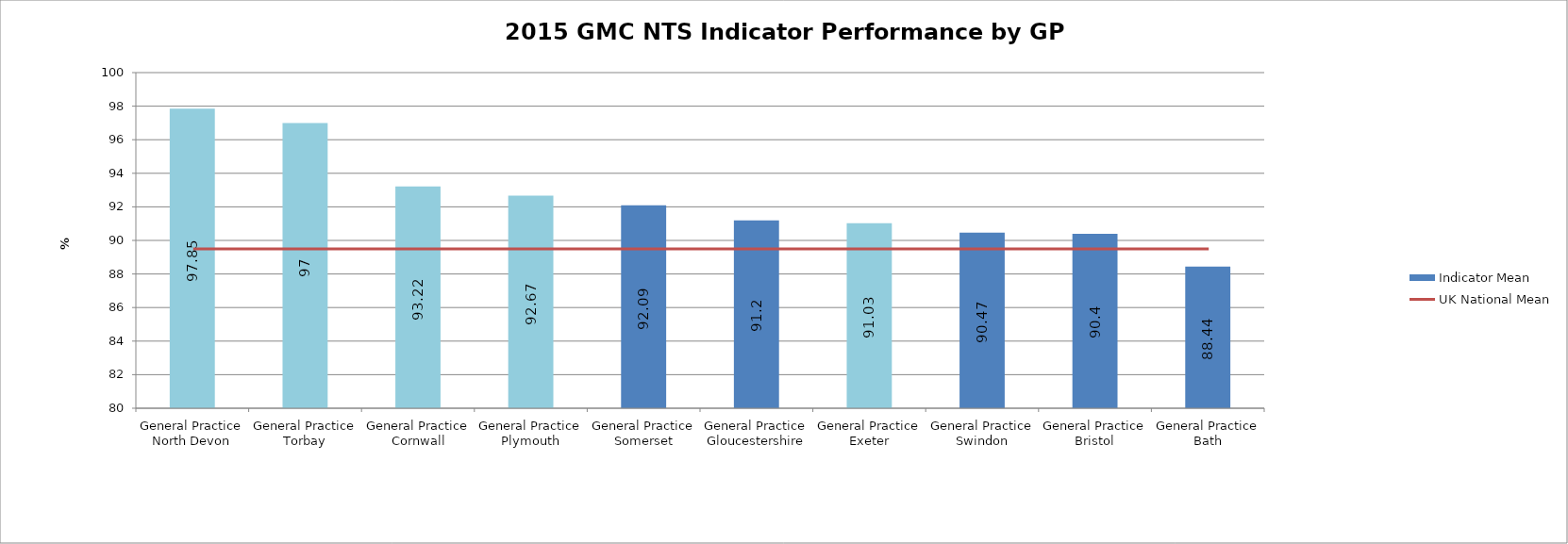
| Category | Indicator Mean |
|---|---|
| General Practice North Devon | 97.85 |
| General Practice Torbay | 97 |
| General Practice Cornwall | 93.22 |
| General Practice Plymouth | 92.67 |
| General Practice Somerset | 92.09 |
| General Practice Gloucestershire | 91.2 |
| General Practice Exeter | 91.03 |
| General Practice Swindon | 90.47 |
| General Practice Bristol | 90.4 |
| General Practice Bath | 88.44 |